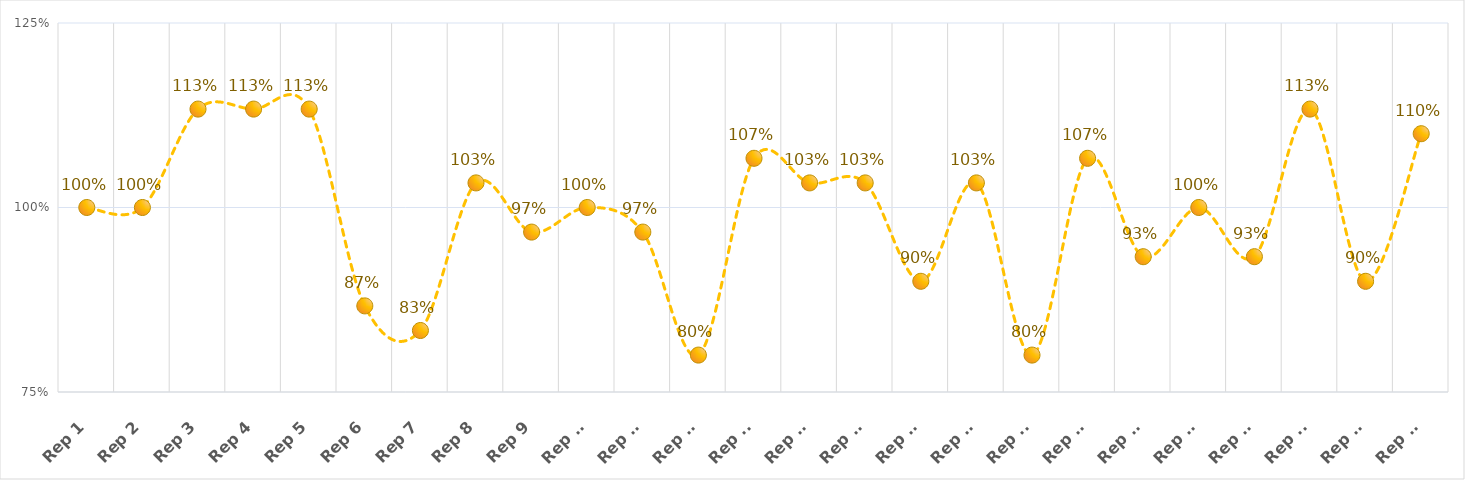
| Category | % OF GOAL REACHED |
|---|---|
| Rep 1 | 1 |
| Rep 2 | 1 |
| Rep 3 | 1.133 |
| Rep 4 | 1.133 |
| Rep 5 | 1.133 |
| Rep 6 | 0.867 |
| Rep 7 | 0.833 |
| Rep 8 | 1.033 |
| Rep 9 | 0.967 |
| Rep 10 | 1 |
| Rep 11 | 0.967 |
| Rep 12 | 0.8 |
| Rep 13 | 1.067 |
| Rep 14 | 1.033 |
| Rep 15 | 1.033 |
| Rep 16 | 0.9 |
| Rep 17 | 1.033 |
| Rep 18 | 0.8 |
| Rep 19 | 1.067 |
| Rep 20 | 0.933 |
| Rep 21 | 1 |
| Rep 22 | 0.933 |
| Rep 23 | 1.133 |
| Rep 24 | 0.9 |
| Rep 25 | 1.1 |